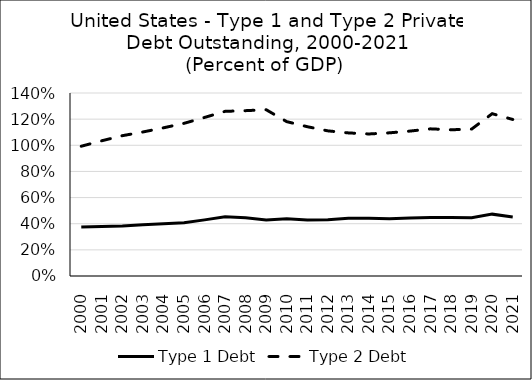
| Category | Type 1 Debt | Type 2 Debt |
|---|---|---|
| 2000.0 | 0.374 | 0.993 |
| 2001.0 | 0.379 | 1.035 |
| 2002.0 | 0.382 | 1.073 |
| 2003.0 | 0.392 | 1.102 |
| 2004.0 | 0.399 | 1.134 |
| 2005.0 | 0.407 | 1.168 |
| 2006.0 | 0.429 | 1.213 |
| 2007.0 | 0.453 | 1.26 |
| 2008.0 | 0.446 | 1.265 |
| 2009.0 | 0.429 | 1.272 |
| 2010.0 | 0.437 | 1.181 |
| 2011.0 | 0.429 | 1.142 |
| 2012.0 | 0.431 | 1.11 |
| 2013.0 | 0.441 | 1.095 |
| 2014.0 | 0.442 | 1.087 |
| 2015.0 | 0.438 | 1.095 |
| 2016.0 | 0.444 | 1.109 |
| 2017.0 | 0.447 | 1.126 |
| 2018.0 | 0.447 | 1.119 |
| 2019.0 | 0.445 | 1.124 |
| 2020.0 | 0.473 | 1.242 |
| 2021.0 | 0.452 | 1.198 |